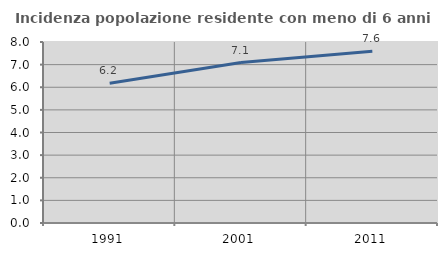
| Category | Incidenza popolazione residente con meno di 6 anni |
|---|---|
| 1991.0 | 6.18 |
| 2001.0 | 7.091 |
| 2011.0 | 7.588 |